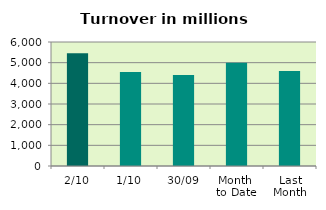
| Category | Series 0 |
|---|---|
| 2/10 | 5451.934 |
| 1/10 | 4549.997 |
| 30/09 | 4407.167 |
| Month 
to Date | 5000.965 |
| Last
Month | 4598.075 |